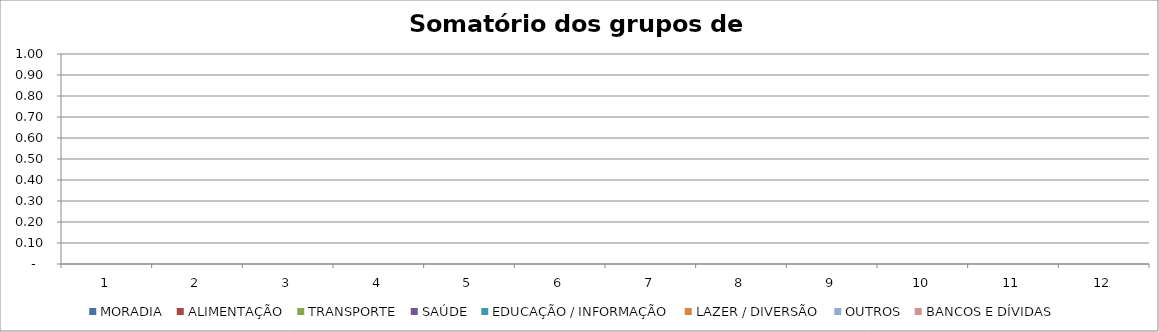
| Category | MORADIA | ALIMENTAÇÃO | TRANSPORTE | SAÚDE | EDUCAÇÃO / INFORMAÇÃO | LAZER / DIVERSÃO | OUTROS | BANCOS E DÍVIDAS |
|---|---|---|---|---|---|---|---|---|
| 0 | 0 | 0 | 0 | 0 | 0 | 0 | 0 | 0 |
| 1 | 0 | 0 | 0 | 0 | 0 | 0 | 0 | 0 |
| 2 | 0 | 0 | 0 | 0 | 0 | 0 | 0 | 0 |
| 3 | 0 | 0 | 0 | 0 | 0 | 0 | 0 | 0 |
| 4 | 0 | 0 | 0 | 0 | 0 | 0 | 0 | 0 |
| 5 | 0 | 0 | 0 | 0 | 0 | 0 | 0 | 0 |
| 6 | 0 | 0 | 0 | 0 | 0 | 0 | 0 | 0 |
| 7 | 0 | 0 | 0 | 0 | 0 | 0 | 0 | 0 |
| 8 | 0 | 0 | 0 | 0 | 0 | 0 | 0 | 0 |
| 9 | 0 | 0 | 0 | 0 | 0 | 0 | 0 | 0 |
| 10 | 0 | 0 | 0 | 0 | 0 | 0 | 0 | 0 |
| 11 | 0 | 0 | 0 | 0 | 0 | 0 | 0 | 0 |